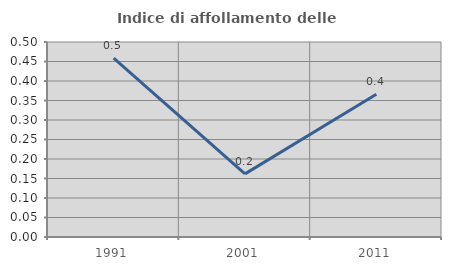
| Category | Indice di affollamento delle abitazioni  |
|---|---|
| 1991.0 | 0.458 |
| 2001.0 | 0.162 |
| 2011.0 | 0.366 |